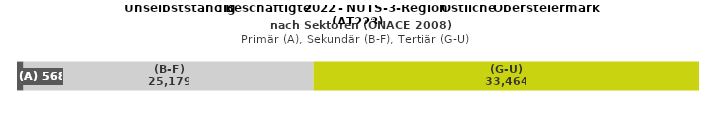
| Category | (A) | (B-F) | (G-U) |
|---|---|---|---|
| 0 | 568 | 25179 | 33464 |